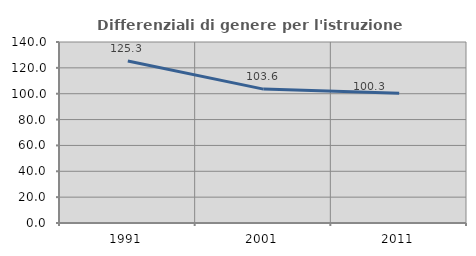
| Category | Differenziali di genere per l'istruzione superiore |
|---|---|
| 1991.0 | 125.257 |
| 2001.0 | 103.552 |
| 2011.0 | 100.314 |